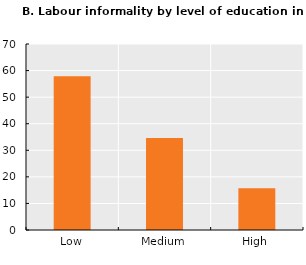
| Category | LAC |
|---|---|
| Low | 57.887 |
| Medium | 34.62 |
| High | 15.727 |